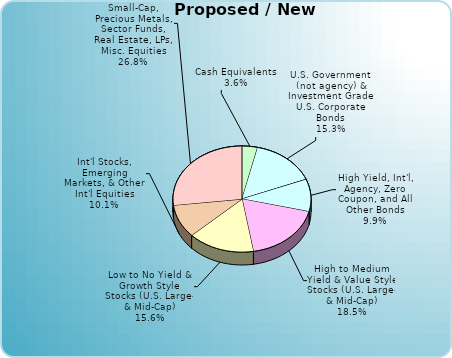
| Category | Series 0 |
|---|---|
| Cash Equivalents | 0.036 |
| U.S. Government (not agency) & Investment Grade U.S. Corporate Bonds | 0.153 |
| Municipal (federally tax-free) Bonds | 0 |
| High Yield, Int'l, Agency, Zero Coupon, and All Other Bonds | 0.099 |
| High to Medium Yield & Value Style Stocks (U.S. Large- & Mid-Cap) | 0.185 |
| Low to No Yield & Growth Style Stocks (U.S. Large- & Mid-Cap) | 0.156 |
| Int'l Stocks, Emerging Markets, & Other Int'l Equities | 0.101 |
| Small-Cap, Precious Metals, Sector Funds, Real Estate, LPs, Misc. Equities | 0.268 |